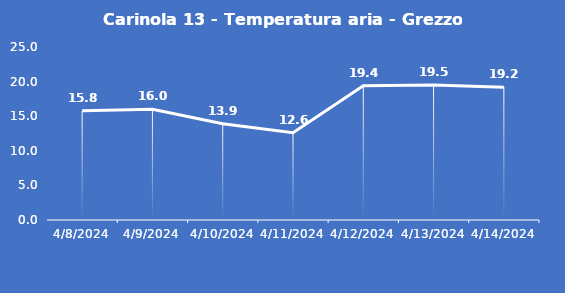
| Category | Carinola 13 - Temperatura aria - Grezzo (°C) |
|---|---|
| 4/8/24 | 15.8 |
| 4/9/24 | 16 |
| 4/10/24 | 13.9 |
| 4/11/24 | 12.6 |
| 4/12/24 | 19.4 |
| 4/13/24 | 19.5 |
| 4/14/24 | 19.2 |